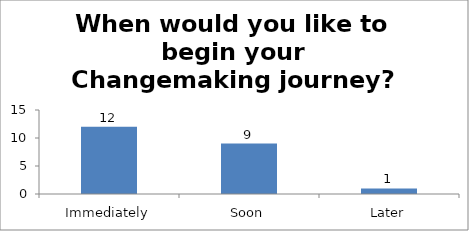
| Category | When would you like to begin your Changemaking journey?  |
|---|---|
| Immediately | 12 |
| Soon | 9 |
| Later | 1 |